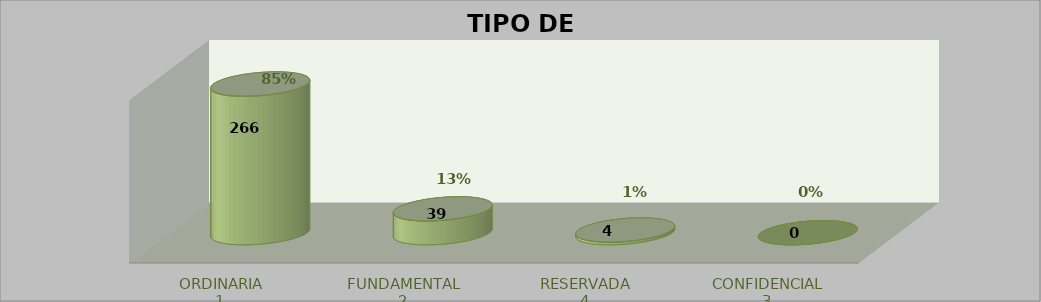
| Category | TIPO DE INFORMACIÓN | Series 2 | Series 3 | Series 1 |
|---|---|---|---|---|
| 0 |  | 274 | 0.848 |  |
| 1 |  | 44 | 0.136 |  |
| 2 |  | 5 | 0.015 |  |
| 3 |  | 0 | 0 |  |